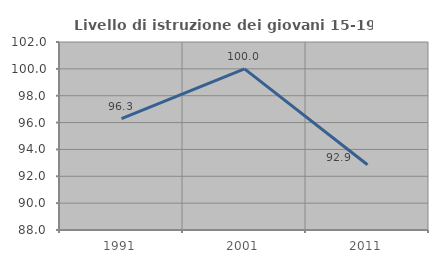
| Category | Livello di istruzione dei giovani 15-19 anni |
|---|---|
| 1991.0 | 96.296 |
| 2001.0 | 100 |
| 2011.0 | 92.857 |